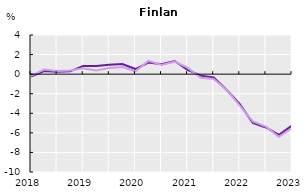
| Category | Basic wage (all sectors) | Basic wage (private sector) | Wage incl. Lump sums and special payments (all sectors) | Wage incl. Lump sums and special payments (private sector) |
|---|---|---|---|---|
| 2018.0 | -0.249 | -0.168 |  |  |
| nan | 0.308 | 0.469 |  |  |
| nan | 0.233 | 0.314 |  |  |
| nan | 0.285 | 0.366 |  |  |
| 2019.0 | 0.841 | 0.603 |  |  |
| nan | 0.842 | 0.369 |  |  |
| nan | 0.95 | 0.635 |  |  |
| nan | 1.039 | 0.724 |  |  |
| 2020.0 | 0.522 | 0.29 |  |  |
| nan | 1.19 | 1.351 |  |  |
| nan | 1.003 | 0.929 |  |  |
| nan | 1.347 | 1.274 |  |  |
| 2021.0 | 0.424 | 0.662 |  |  |
| nan | -0.153 | -0.376 |  |  |
| nan | -0.348 | -0.492 |  |  |
| nan | -1.618 | -1.611 |  |  |
| 2022.0 | -3.069 | -3.211 |  |  |
| nan | -4.976 | -4.827 |  |  |
| nan | -5.45 | -5.369 |  |  |
| nan | -6.204 | -6.405 |  |  |
| 2023.0 | -5.241 | -5.51 |  |  |